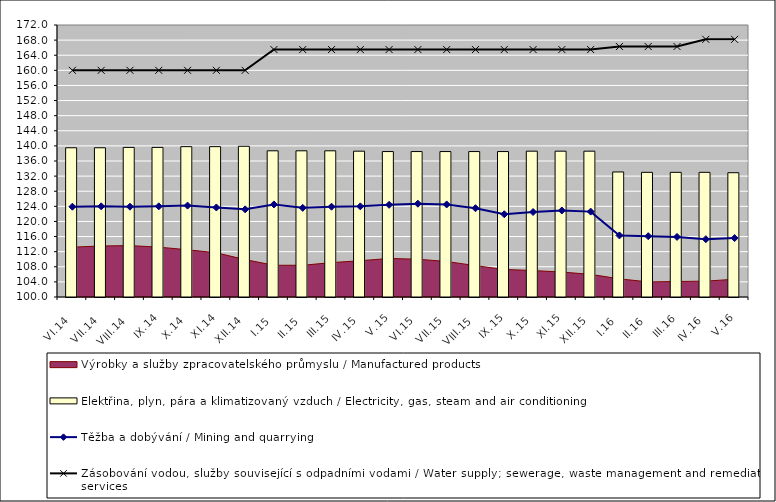
| Category | Elektřina, plyn, pára a klimatizovaný vzduch / Electricity, gas, steam and air conditioning |
|---|---|
| VI.14 | 139.5 |
| VII.14 | 139.5 |
| VIII.14 | 139.6 |
| IX.14 | 139.6 |
| X.14 | 139.8 |
| XI.14 | 139.8 |
| XII.14 | 139.9 |
| I.15 | 138.7 |
| II.15 | 138.7 |
| III.15 | 138.7 |
| IV.15 | 138.6 |
| V.15 | 138.5 |
| VI.15 | 138.5 |
| VII.15 | 138.5 |
| VIII.15 | 138.5 |
| IX.15 | 138.5 |
| X.15 | 138.6 |
| XI.15 | 138.6 |
| XII.15 | 138.6 |
| I.16 | 133.1 |
| II.16 | 133 |
| III.16 | 133 |
| IV.16 | 133 |
| V.16 | 132.9 |